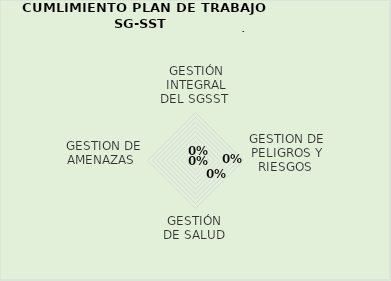
| Category | 1ER TRIMESTRE  |
|---|---|
| GESTIÓN INTEGRAL DEL SGSST  | 0 |
| GESTION DE PELIGROS Y RIESGOS  | 0 |
| GESTIÓN  DE SALUD  | 0 |
| GESTION DE AMENAZAS  | 0 |